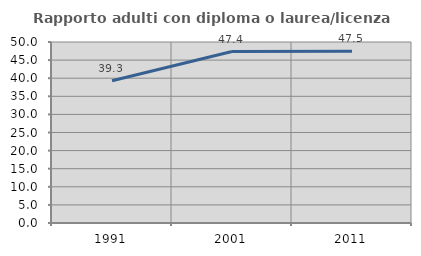
| Category | Rapporto adulti con diploma o laurea/licenza media  |
|---|---|
| 1991.0 | 39.274 |
| 2001.0 | 47.357 |
| 2011.0 | 47.458 |